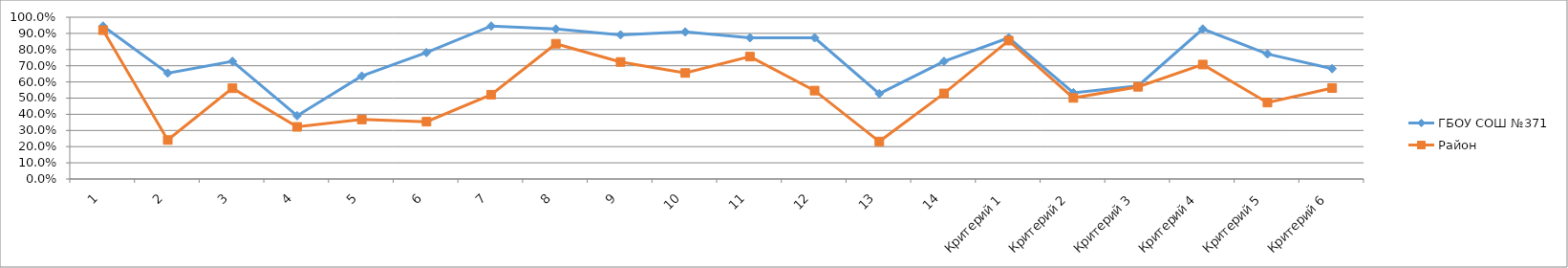
| Category | ГБОУ СОШ №371 | Район |
|---|---|---|
| 1 | 0.945 | 0.92 |
| 2 | 0.655 | 0.241 |
| 3 | 0.727 | 0.561 |
| 4 | 0.391 | 0.322 |
| 5 | 0.636 | 0.368 |
| 6 | 0.782 | 0.354 |
| 7 | 0.945 | 0.521 |
| 8 | 0.927 | 0.836 |
| 9 | 0.891 | 0.723 |
| 10 | 0.909 | 0.655 |
| 11 | 0.873 | 0.756 |
| 12 | 0.873 | 0.546 |
| 13 | 0.527 | 0.232 |
| 14 | 0.727 | 0.529 |
| Критерий 1 | 0.873 | 0.855 |
| Критерий 2 | 0.533 | 0.501 |
| Критерий 3 | 0.576 | 0.57 |
| Критерий 4 | 0.927 | 0.707 |
| Критерий 5 | 0.773 | 0.472 |
| Критерий 6 | 0.682 | 0.562 |